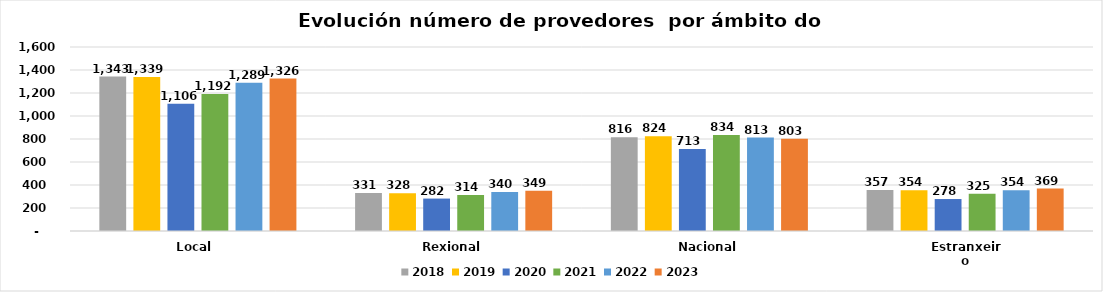
| Category | 2018 | 2019 | 2020 | 2021 | 2022 | 2023 |
|---|---|---|---|---|---|---|
| Local  | 1343 | 1339 | 1106 | 1192 | 1289 | 1326 |
| Rexional | 331 | 328 | 282 | 314 | 340 | 349 |
| Nacional | 816 | 824 | 713 | 834 | 813 | 803 |
| Estranxeiro | 357 | 354 | 278 | 325 | 354 | 369 |